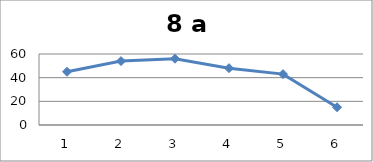
| Category | Series 0 |
|---|---|
| 0 | 45 |
| 1 | 54 |
| 2 | 56 |
| 3 | 48 |
| 4 | 43 |
| 5 | 15 |